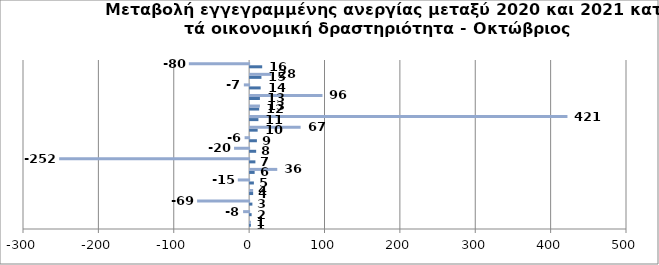
| Category | Series 0 | Series 1 |
|---|---|---|
| 0 | 1 | 1 |
| 1 | 2 | -8 |
| 2 | 3 | -69 |
| 3 | 4 | 4 |
| 4 | 5 | -15 |
| 5 | 6 | 36 |
| 6 | 7 | -252 |
| 7 | 8 | -20 |
| 8 | 9 | -6 |
| 9 | 10 | 67 |
| 10 | 11 | 421 |
| 11 | 12 | 13 |
| 12 | 13 | 96 |
| 13 | 14 | -7 |
| 14 | 15 | 28 |
| 15 | 16 | -80 |